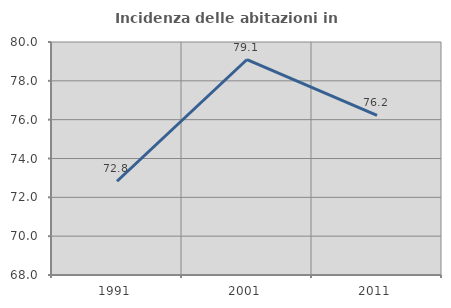
| Category | Incidenza delle abitazioni in proprietà  |
|---|---|
| 1991.0 | 72.828 |
| 2001.0 | 79.098 |
| 2011.0 | 76.224 |